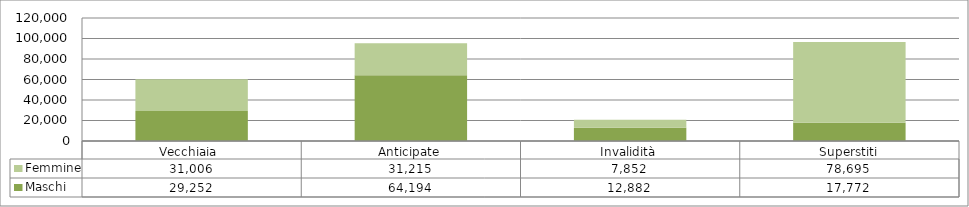
| Category | Maschi | Femmine |
|---|---|---|
| Vecchiaia  | 29252 | 31006 |
| Anticipate | 64194 | 31215 |
| Invalidità | 12882 | 7852 |
| Superstiti | 17772 | 78695 |